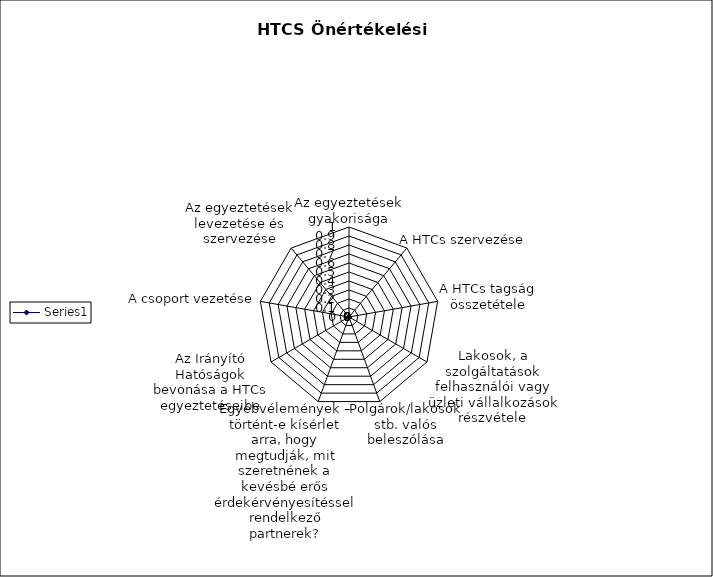
| Category | Series 0 |
|---|---|
| Az egyeztetések gyakorisága | 0 |
| A HTCs szervezése | 0 |
| A HTCs tagság összetétele | 0 |
| Lakosok, a szolgáltatások felhasználói vagy üzleti vállalkozások részvétele | 0 |
| Polgárok/lakosok stb. valós beleszólása | 0 |
| Egyébvélemények – történt-e kísérlet arra, hogy megtudják, mit szeretnének a kevésbé erős érdekérvényesítéssel rendelkező partnerek? | 0 |
| Az Irányító Hatóságok bevonása a HTCs egyeztetéseibe | 0 |
| A csoport vezetése | 0 |
| Az egyeztetések levezetése és szervezése | 0 |